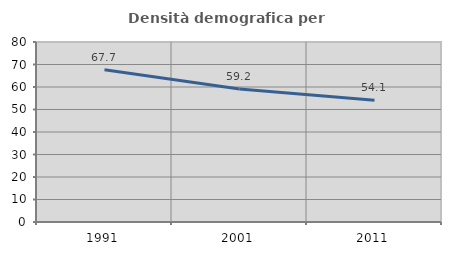
| Category | Densità demografica |
|---|---|
| 1991.0 | 67.712 |
| 2001.0 | 59.155 |
| 2011.0 | 54.132 |